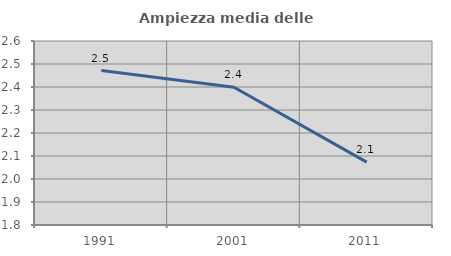
| Category | Ampiezza media delle famiglie |
|---|---|
| 1991.0 | 2.471 |
| 2001.0 | 2.399 |
| 2011.0 | 2.073 |